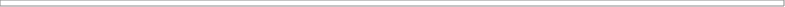
| Category | Рентабельность активов | Рентабельность постоянных активов |
|---|---|---|
| 2012.0 | -0.054 | -0.059 |
| 2013.0 | 0.501 | 0.811 |
| 2014.0 | 0.371 | 0.938 |
| 2015.0 | 0.345 | 1.165 |
| 2016.0 | 0.317 | 1.433 |